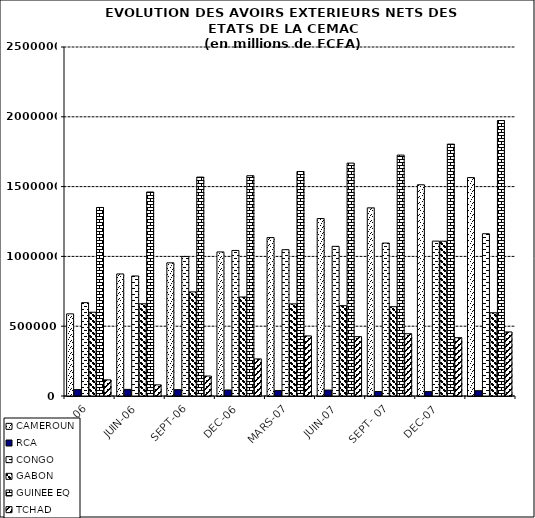
| Category | CAMEROUN | RCA | CONGO | GABON | GUINEE EQ | TCHAD |
|---|---|---|---|---|---|---|
| _x0007_MARS-06 | 588306 | 45887 | 668757 | 599881 | 1350415 | 115456 |
| _x0007_JUIN-06 | 874415 | 47364 | 859810 | 660769 | 1461268 | 79906 |
| _x0007_SEPT-06 | 953928 | 45534 | 999577 | 745941 | 1568002 | 143111 |
| _x0006_DEC-06 | 1031904 | 42989 | 1042569 | 709257 | 1577990 | 265728 |
| _x0007_MARS-07 | 1134884 | 38802 | 1048059 | 660083 | 1608139 | 430287 |
| _x0007_JUIN-07 | 1271084 | 42460 | 1072116 | 647276 | 1668188 | 425241 |
| _x0008_SEPT- 07 | 1347667 | 32023 | 1095472 | 639852 | 1725777 | 446174 |
| _x0006_DEC-07 | 1513195 | 31552 | 1109504 | 1108897 | 1804294 | 417823 |